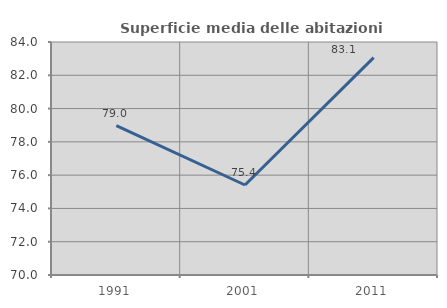
| Category | Superficie media delle abitazioni occupate |
|---|---|
| 1991.0 | 78.97 |
| 2001.0 | 75.407 |
| 2011.0 | 83.06 |